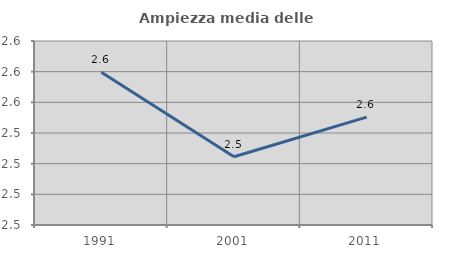
| Category | Ampiezza media delle famiglie |
|---|---|
| 1991.0 | 2.58 |
| 2001.0 | 2.524 |
| 2011.0 | 2.55 |